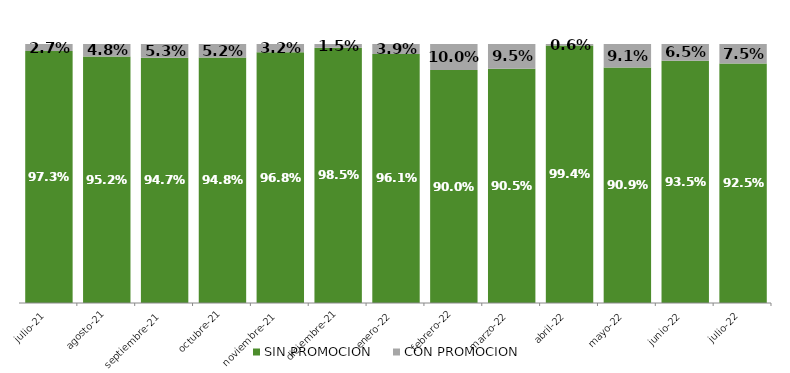
| Category | SIN PROMOCION   | CON PROMOCION   |
|---|---|---|
| 2021-07-01 | 0.973 | 0.027 |
| 2021-08-01 | 0.952 | 0.048 |
| 2021-09-01 | 0.947 | 0.053 |
| 2021-10-01 | 0.948 | 0.052 |
| 2021-11-01 | 0.968 | 0.032 |
| 2021-12-01 | 0.985 | 0.015 |
| 2022-01-01 | 0.961 | 0.039 |
| 2022-02-01 | 0.9 | 0.1 |
| 2022-03-01 | 0.905 | 0.095 |
| 2022-04-01 | 0.994 | 0.006 |
| 2022-05-01 | 0.909 | 0.091 |
| 2022-06-01 | 0.935 | 0.065 |
| 2022-07-01 | 0.925 | 0.075 |